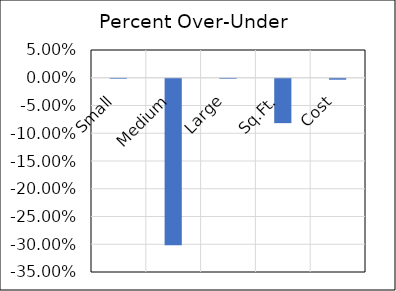
| Category | Over-Under |
|---|---|
| Small | 0 |
| Medium | -0.3 |
| Large | 0 |
| Sq.Ft. | -0.08 |
| Cost | -0.002 |